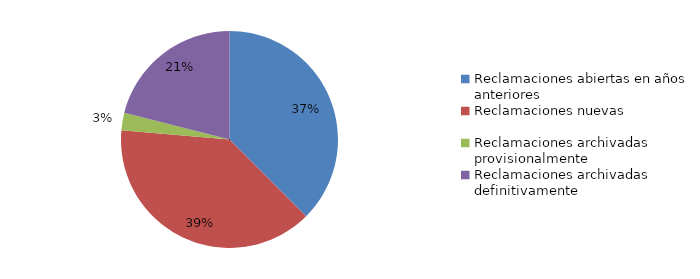
| Category | Series 0 |
|---|---|
| Reclamaciones abiertas en años anteriores | 173 |
| Reclamaciones nuevas   | 179 |
| Reclamaciones archivadas provisionalmente | 12 |
| Reclamaciones archivadas definitivamente | 97 |